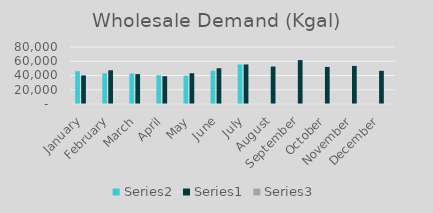
| Category | Series 1 | Series 0 | Series 2 |
|---|---|---|---|
| January | 46042 | 40140 | 1.147 |
| February | 42951.714 | 47315 | 0.908 |
| March | 42828.697 | 41977 | 1.02 |
| April | 40411.734 | 38996.46 | 1.036 |
| May | 39719.105 | 43187.656 | 0.92 |
| June | 46763.685 | 50131.03 | 0.933 |
| July | 55518.584 | 55518.584 | 1 |
| August | 0 | 52591.348 | 0 |
| September | 0 | 61625.007 | 0 |
| October | 0 | 52042.125 | 0 |
| November | 0 | 53432.969 | 0 |
| December | 0 | 46567.149 | 0 |